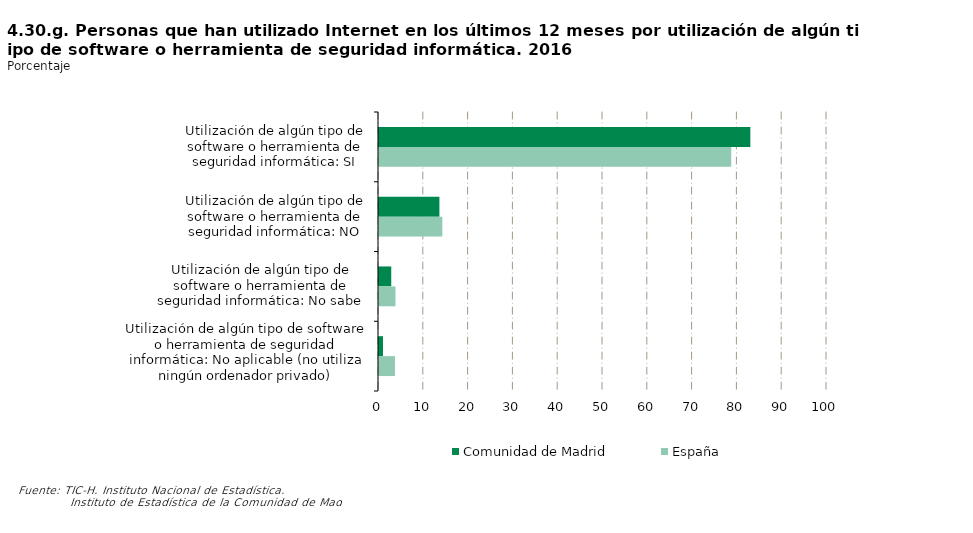
| Category | Comunidad de Madrid | España |
|---|---|---|
| Utilización de algún tipo de software o herramienta de seguridad informática: SI | 82.887 | 78.629 |
| Utilización de algún tipo de software o herramienta de seguridad informática: NO | 13.483 | 14.135 |
| Utilización de algún tipo de software o herramienta de seguridad informática: No sabe | 2.734 | 3.675 |
| Utilización de algún tipo de software o herramienta de seguridad informática: No aplicable (no utiliza ningún ordenador privado) | 0.895 | 3.561 |